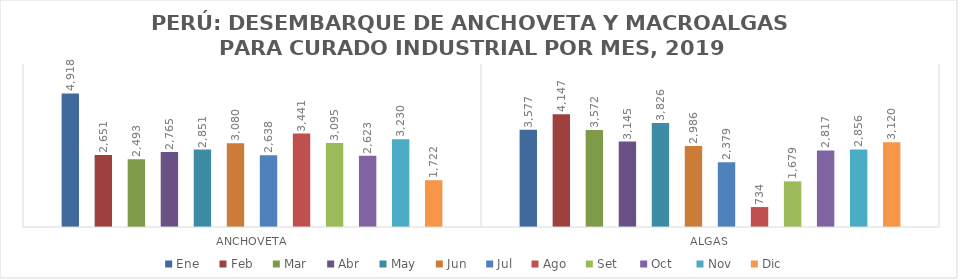
| Category | Ene    | Feb    | Mar    | Abr    | May    | Jun    | Jul    | Ago    | Set     | Oct     | Nov    | Dic     |
|---|---|---|---|---|---|---|---|---|---|---|---|---|
| Anchoveta | 4917.858 | 2650.964 | 2493.034 | 2765.174 | 2850.627 | 3080.283 | 2638.286 | 3440.514 | 3095.391 | 2623.233 | 3230.488 | 1721.895 |
| Algas | 3576.8 | 4147.47 | 3572.188 | 3145.18 | 3825.86 | 2985.61 | 2378.89 | 733.77 | 1679.313 | 2816.675 | 2855.503 | 3119.525 |